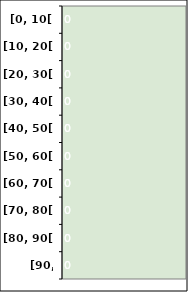
| Category | Series 0 |
|---|---|
| [0, 10[ | 0 |
| [10, 20[ | 0 |
| [20, 30[ | 0 |
| [30, 40[ | 0 |
| [40, 50[ | 0 |
| [50, 60[ | 0 |
| [60, 70[ | 0 |
| [70, 80[ | 0 |
| [80, 90[ | 0 |
| [90, 100[ | 0 |